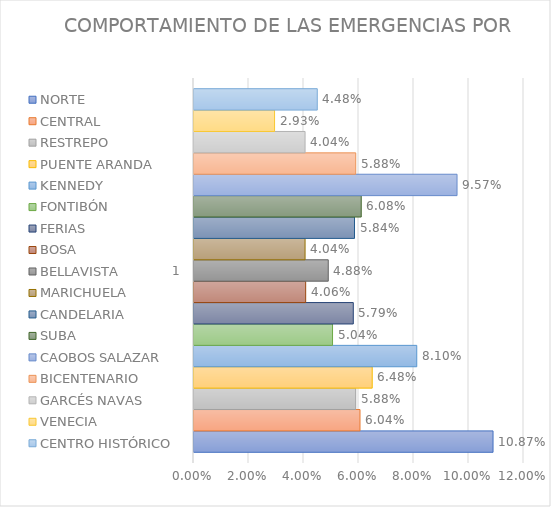
| Category | NORTE | CENTRAL | RESTREPO | PUENTE ARANDA | KENNEDY | FONTIBÓN | FERIAS | BOSA | BELLAVISTA | MARICHUELA | CANDELARIA | SUBA | CAOBOS SALAZAR | BICENTENARIO | GARCÉS NAVAS | VENECIA | CENTRO HISTÓRICO |
|---|---|---|---|---|---|---|---|---|---|---|---|---|---|---|---|---|---|
| 0 | 0.109 | 0.06 | 0.059 | 0.065 | 0.081 | 0.05 | 0.058 | 0.041 | 0.049 | 0.04 | 0.058 | 0.061 | 0.096 | 0.059 | 0.04 | 0.029 | 0.045 |